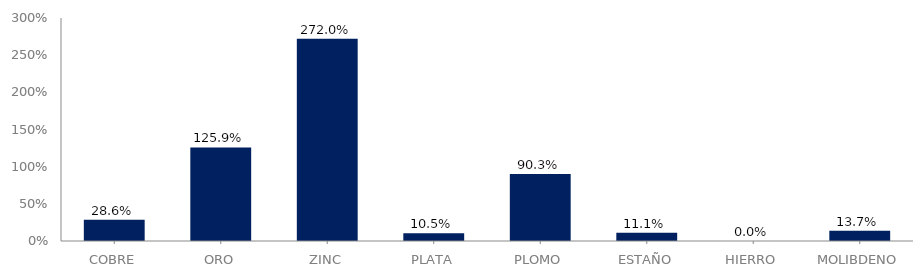
| Category | Series 0 |
|---|---|
| COBRE | 0.286 |
| ORO | 1.259 |
| ZINC | 2.72 |
| PLATA | 0.105 |
| PLOMO | 0.903 |
| ESTAÑO | 0.111 |
| HIERRO | 0 |
| MOLIBDENO | 0.137 |